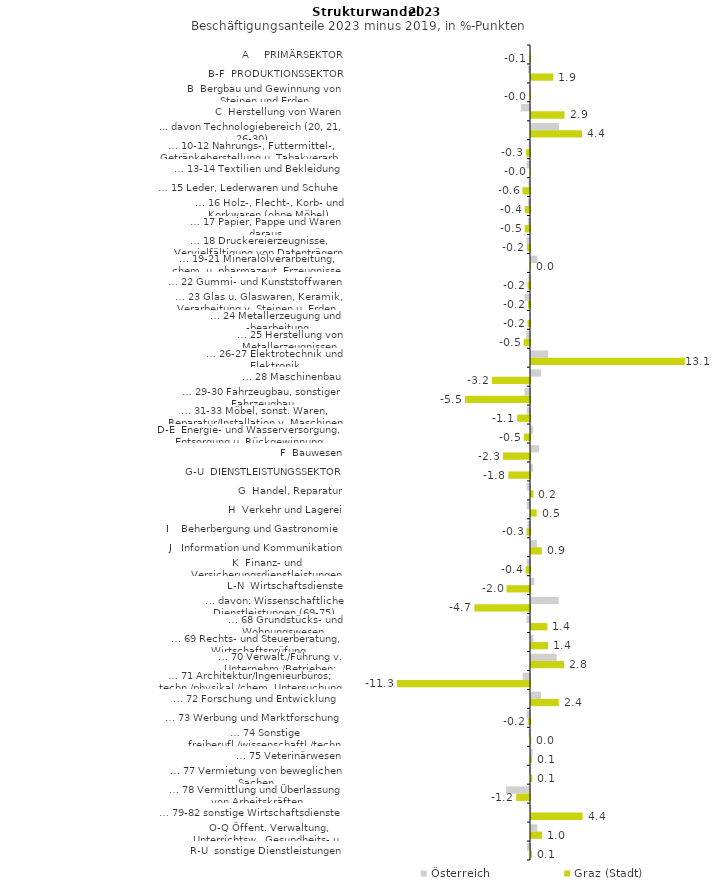
| Category | Österreich | Graz (Stadt) |
|---|---|---|
| A     PRIMÄRSEKTOR | -0.007 | -0.051 |
| B-F  PRODUKTIONSSEKTOR | -0.161 | 1.898 |
| B  Bergbau und Gewinnung von Steinen und Erden | -0.086 | -0.024 |
| C  Herstellung von Waren | -0.782 | 2.859 |
| ... davon Technologiebereich (20, 21, 26-30) | 2.393 | 4.351 |
| … 10-12 Nahrungs-, Futtermittel-, Getränkeherstellung u. Tabakverarb. | -0.116 | -0.331 |
| … 13-14 Textilien und Bekleidung | -0.289 | -0.019 |
| … 15 Leder, Lederwaren und Schuhe | -0.13 | -0.634 |
| … 16 Holz-, Flecht-, Korb- und Korkwaren (ohne Möbel)  | -0.177 | -0.442 |
| … 17 Papier, Pappe und Waren daraus  | -0.185 | -0.454 |
| … 18 Druckereierzeugnisse, Vervielfältigung von Datenträgern | -0.288 | -0.248 |
| … 19-21 Mineralölverarbeitung, chem. u. pharmazeut. Erzeugnisse | 0.549 | 0.012 |
| … 22 Gummi- und Kunststoffwaren | -0.139 | -0.208 |
| … 23 Glas u. Glaswaren, Keramik, Verarbeitung v. Steinen u. Erden  | -0.462 | -0.168 |
| … 24 Metallerzeugung und -bearbeitung | -0.032 | -0.211 |
| … 25 Herstellung von Metallerzeugnissen  | -0.325 | -0.547 |
| … 26-27 Elektrotechnik und Elektronik | 1.462 | 13.115 |
| … 28 Maschinenbau | 0.864 | -3.244 |
| … 29-30 Fahrzeugbau, sonstiger Fahrzeugbau | -0.462 | -5.533 |
| … 31-33 Möbel, sonst. Waren, Reparatur/Installation v. Maschinen | -0.273 | -1.091 |
| D-E  Energie- und Wasserversorgung, Entsorgung u. Rückgewinnung | 0.184 | -0.519 |
| F  Bauwesen | 0.684 | -2.313 |
| G-U  DIENSTLEISTUNGSSEKTOR | 0.167 | -1.847 |
| G  Handel, Reparatur | -0.273 | 0.212 |
| H  Verkehr und Lagerei | -0.287 | 0.483 |
| I    Beherbergung und Gastronomie | -0.218 | -0.289 |
| J   Information und Kommunikation | 0.499 | 0.917 |
| K  Finanz- und Versicherungsdienstleistungen | -0.279 | -0.373 |
| L-N  Wirtschaftsdienste | 0.279 | -1.999 |
| … davon: Wissenschaftliche Dienstleistungen (69-75) | 2.367 | -4.736 |
| … 68 Grundstücks- und Wohnungswesen  | -0.294 | 1.397 |
| … 69 Rechts- und Steuerberatung, Wirtschaftsprüfung | 0.205 | 1.447 |
| … 70 Verwalt./Führung v. Unternehm./Betrieben; Unternehmensberat. | 2.188 | 2.827 |
| … 71 Architektur/Ingenieurbüros; techn./physikal./chem. Untersuchung | -0.622 | -11.347 |
| … 72 Forschung und Entwicklung  | 0.854 | 2.37 |
| … 73 Werbung und Marktforschung | -0.273 | -0.151 |
| … 74 Sonstige freiberufl./wissenschaftl./techn. Tätigkeiten | -0.124 | 0.031 |
| … 75 Veterinärwesen | 0.14 | 0.085 |
| … 77 Vermietung von beweglichen Sachen  | -0.077 | 0.107 |
| … 78 Vermittlung und Überlassung von Arbeitskräften | -2.035 | -1.175 |
| … 79-82 sonstige Wirtschaftsdienste | 0.039 | 4.4 |
| O-Q Öffent. Verwaltung, Unterrichtsw., Gesundheits- u. Sozialwesen | 0.535 | 0.958 |
| R-U  sonstige Dienstleistungen | -0.256 | 0.09 |